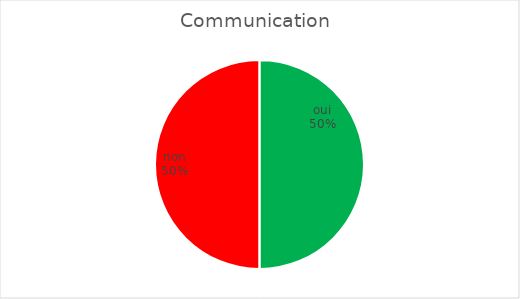
| Category | Communication  |
|---|---|
| oui | 4 |
| non | 4 |